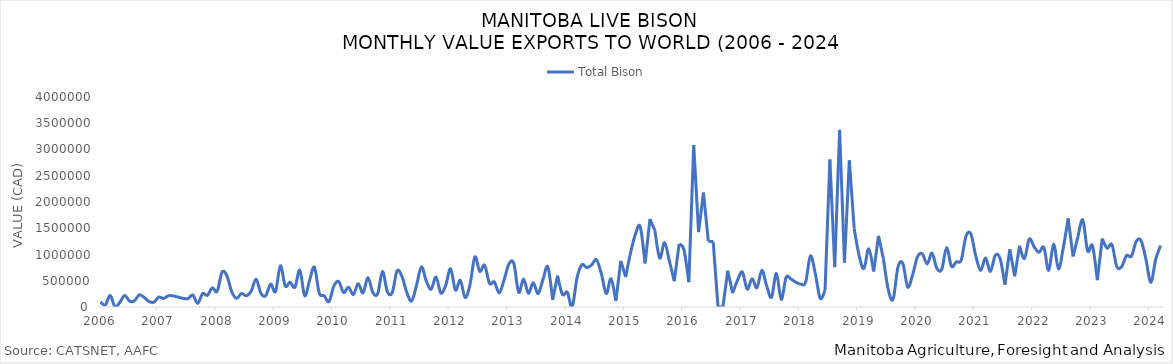
| Category | Total Bison |
|---|---|
| 2006-01-01 | 94831 |
| 2006-02-01 | 39924 |
| 2006-03-01 | 221638 |
| 2006-04-01 | 0 |
| 2006-05-01 | 92421 |
| 2006-06-01 | 219057 |
| 2006-07-01 | 110957 |
| 2006-08-01 | 120486 |
| 2006-09-01 | 231165 |
| 2006-10-01 | 181592 |
| 2006-11-01 | 104701 |
| 2006-12-01 | 91894 |
| 2007-01-01 | 189119 |
| 2007-02-01 | 162426 |
| 2007-03-01 | 216115 |
| 2007-04-01 | 209962 |
| 2007-05-01 | 187979 |
| 2007-06-01 | 164889 |
| 2007-07-01 | 158492 |
| 2007-08-01 | 229251 |
| 2007-09-01 | 70037 |
| 2007-10-01 | 253310 |
| 2007-11-01 | 222501 |
| 2007-12-01 | 366639 |
| 2008-01-01 | 298590 |
| 2008-02-01 | 664293 |
| 2008-03-01 | 595580 |
| 2008-04-01 | 290569 |
| 2008-05-01 | 165602 |
| 2008-06-01 | 258092 |
| 2008-07-01 | 213325 |
| 2008-08-01 | 302841 |
| 2008-09-01 | 529307 |
| 2008-10-01 | 260626 |
| 2008-11-01 | 217450 |
| 2008-12-01 | 435997 |
| 2009-01-01 | 293947 |
| 2009-02-01 | 783238 |
| 2009-03-01 | 401225 |
| 2009-04-01 | 473013 |
| 2009-05-01 | 376289 |
| 2009-06-01 | 702041 |
| 2009-07-01 | 214676 |
| 2009-08-01 | 503890 |
| 2009-09-01 | 758535 |
| 2009-10-01 | 263519 |
| 2009-11-01 | 213775 |
| 2009-12-01 | 103173 |
| 2010-01-01 | 400215 |
| 2010-02-01 | 484084 |
| 2010-03-01 | 275903 |
| 2010-04-01 | 377853 |
| 2010-05-01 | 234758 |
| 2010-06-01 | 444536 |
| 2010-07-01 | 268996 |
| 2010-08-01 | 561166 |
| 2010-09-01 | 280590 |
| 2010-10-01 | 250989 |
| 2010-11-01 | 678321 |
| 2010-12-01 | 290670 |
| 2011-01-01 | 272699 |
| 2011-02-01 | 688240 |
| 2011-03-01 | 582531 |
| 2011-04-01 | 276345 |
| 2011-05-01 | 113595 |
| 2011-06-01 | 412650 |
| 2011-07-01 | 764770 |
| 2011-08-01 | 498377 |
| 2011-09-01 | 336222 |
| 2011-10-01 | 571497 |
| 2011-11-01 | 266400 |
| 2011-12-01 | 412232 |
| 2012-01-01 | 729575 |
| 2012-02-01 | 321496 |
| 2012-03-01 | 508652 |
| 2012-04-01 | 179064 |
| 2012-05-01 | 428861 |
| 2012-06-01 | 955157 |
| 2012-07-01 | 676923 |
| 2012-08-01 | 797322 |
| 2012-09-01 | 452054 |
| 2012-10-01 | 477165 |
| 2012-11-01 | 267645 |
| 2012-12-01 | 515680 |
| 2013-01-01 | 820069 |
| 2013-02-01 | 830307 |
| 2013-03-01 | 281383 |
| 2013-04-01 | 532884 |
| 2013-05-01 | 261706 |
| 2013-06-01 | 462111 |
| 2013-07-01 | 256069 |
| 2013-08-01 | 522091 |
| 2013-09-01 | 764483 |
| 2013-10-01 | 137054 |
| 2013-11-01 | 596471 |
| 2013-12-01 | 239079 |
| 2014-01-01 | 281263 |
| 2014-02-01 | 0 |
| 2014-03-01 | 553983 |
| 2014-04-01 | 805179 |
| 2014-05-01 | 750543 |
| 2014-06-01 | 798681 |
| 2014-07-01 | 901252 |
| 2014-08-01 | 636624 |
| 2014-09-01 | 257767 |
| 2014-10-01 | 536204 |
| 2014-11-01 | 113430 |
| 2014-12-01 | 879496 |
| 2015-01-01 | 571277 |
| 2015-02-01 | 1026996 |
| 2015-03-01 | 1383354 |
| 2015-04-01 | 1529690 |
| 2015-05-01 | 830315 |
| 2015-06-01 | 1676369 |
| 2015-07-01 | 1462291 |
| 2015-08-01 | 931601 |
| 2015-09-01 | 1226594 |
| 2015-10-01 | 872505 |
| 2015-11-01 | 491413 |
| 2015-12-01 | 1202962 |
| 2016-01-01 | 1085929 |
| 2016-02-01 | 473153 |
| 2016-03-01 | 3084377 |
| 2016-04-01 | 1426302 |
| 2016-05-01 | 2177788 |
| 2016-06-01 | 1253102 |
| 2016-07-01 | 1245126 |
| 2016-08-01 | 0 |
| 2016-09-01 | 0 |
| 2016-10-01 | 691104 |
| 2016-11-01 | 264327 |
| 2016-12-01 | 508586 |
| 2017-01-01 | 666139 |
| 2017-02-01 | 340391 |
| 2017-03-01 | 537951 |
| 2017-04-01 | 367315 |
| 2017-05-01 | 699820 |
| 2017-06-01 | 401823 |
| 2017-07-01 | 185145 |
| 2017-08-01 | 639701 |
| 2017-09-01 | 143343 |
| 2017-10-01 | 565550 |
| 2017-11-01 | 530933 |
| 2017-12-01 | 472384 |
| 2018-01-01 | 435926 |
| 2018-02-01 | 468491 |
| 2018-03-01 | 972583 |
| 2018-04-01 | 635751 |
| 2018-05-01 | 166706 |
| 2018-06-01 | 314702 |
| 2018-07-01 | 2809004 |
| 2018-08-01 | 759613 |
| 2018-09-01 | 3373651 |
| 2018-10-01 | 844363 |
| 2018-11-01 | 2794399 |
| 2018-12-01 | 1492531 |
| 2019-01-01 | 983170 |
| 2019-02-01 | 732563 |
| 2019-03-01 | 1109151 |
| 2019-04-01 | 677644 |
| 2019-05-01 | 1355644 |
| 2019-06-01 | 924803 |
| 2019-07-01 | 331652 |
| 2019-08-01 | 149831 |
| 2019-09-01 | 762568 |
| 2019-10-01 | 827801 |
| 2019-11-01 | 379587 |
| 2019-12-01 | 610154 |
| 2020-01-01 | 952571 |
| 2020-02-01 | 1013617 |
| 2020-03-01 | 818116 |
| 2020-04-01 | 1027132 |
| 2020-05-01 | 735982 |
| 2020-06-01 | 717059 |
| 2020-07-01 | 1128385 |
| 2020-08-01 | 776061 |
| 2020-09-01 | 860401 |
| 2020-10-01 | 893267 |
| 2020-11-01 | 1353911 |
| 2020-12-01 | 1387658 |
| 2021-01-01 | 972210 |
| 2021-02-01 | 695060 |
| 2021-03-01 | 935654 |
| 2021-04-01 | 675493 |
| 2021-05-01 | 980266 |
| 2021-06-01 | 922153 |
| 2021-07-01 | 425086 |
| 2021-08-01 | 1099720 |
| 2021-09-01 | 583944 |
| 2021-10-01 | 1164719 |
| 2021-11-01 | 924085 |
| 2021-12-01 | 1293322 |
| 2022-01-01 | 1146062 |
| 2022-02-01 | 1039337 |
| 2022-03-01 | 1133703 |
| 2022-04-01 | 697376 |
| 2022-05-01 | 1198467 |
| 2022-06-01 | 724310 |
| 2022-07-01 | 1129588 |
| 2022-08-01 | 1688071 |
| 2022-09-01 | 962418 |
| 2022-10-01 | 1338155 |
| 2022-11-01 | 1658125 |
| 2022-12-01 | 1068399 |
| 2023-01-01 | 1167659 |
| 2023-02-01 | 510887 |
| 2023-03-01 | 1301802 |
| 2023-04-01 | 1122006 |
| 2023-05-01 | 1188122 |
| 2023-06-01 | 767578 |
| 2023-07-01 | 769575 |
| 2023-08-01 | 979606 |
| 2023-09-01 | 968350 |
| 2023-10-01 | 1248484 |
| 2023-11-01 | 1261710 |
| 2023-12-01 | 903435 |
| 2024-01-01 | 468061 |
| 2024-02-01 | 906529 |
| 2024-03-01 | 1172141 |